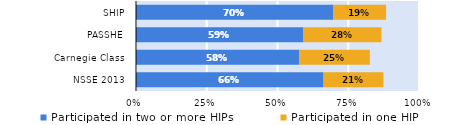
| Category | Participated in two or more HIPs | Participated in one HIP |
|---|---|---|
| NSSE 2013 | 0.663 | 0.212 |
| Carnegie Class | 0.576 | 0.25 |
| PASSHE | 0.592 | 0.276 |
| SHIP | 0.698 | 0.186 |